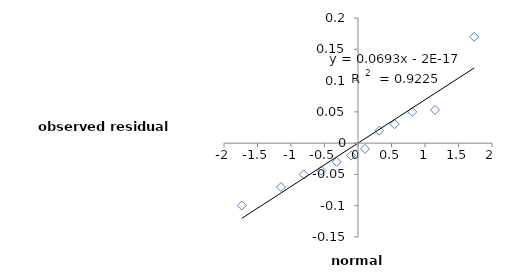
| Category | ei |
|---|---|
| -1.7341562983883385 | -0.1 |
| -1.1492082681575793 | -0.07 |
| -0.8100916294968781 | -0.05 |
| -0.5465368984241359 | -0.044 |
| -0.3172988787259257 | -0.03 |
| -0.10416467748839144 | -0.02 |
| 0.10416467748839034 | -0.009 |
| 0.3172988787259257 | 0.02 |
| 0.5465368984241359 | 0.03 |
| 0.8100916294968781 | 0.05 |
| 1.1492082681575793 | 0.053 |
| 1.7341562983883385 | 0.17 |